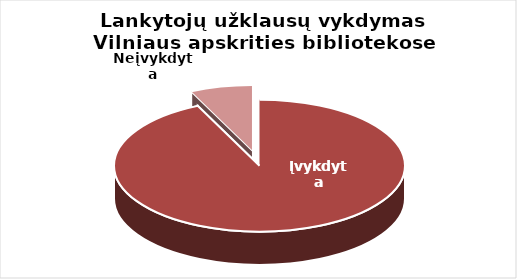
| Category | Series 0 |
|---|---|
| Įvykdyta | 322173 |
| Neįvykdyta | 24166 |